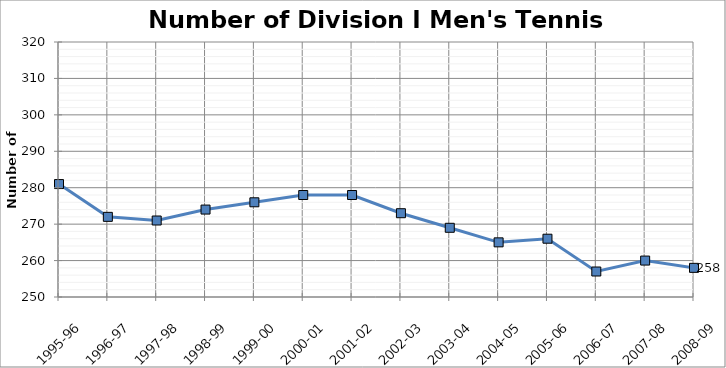
| Category | Men |
|---|---|
| 1995-96 | 281 |
| 1996-97 | 272 |
| 1997-98 | 271 |
| 1998-99 | 274 |
| 1999-00 | 276 |
| 2000-01 | 278 |
| 2001-02 | 278 |
| 2002-03 | 273 |
| 2003-04 | 269 |
| 2004-05 | 265 |
| 2005-06 | 266 |
| 2006-07 | 257 |
| 2007-08 | 260 |
| 2008-09 | 258 |